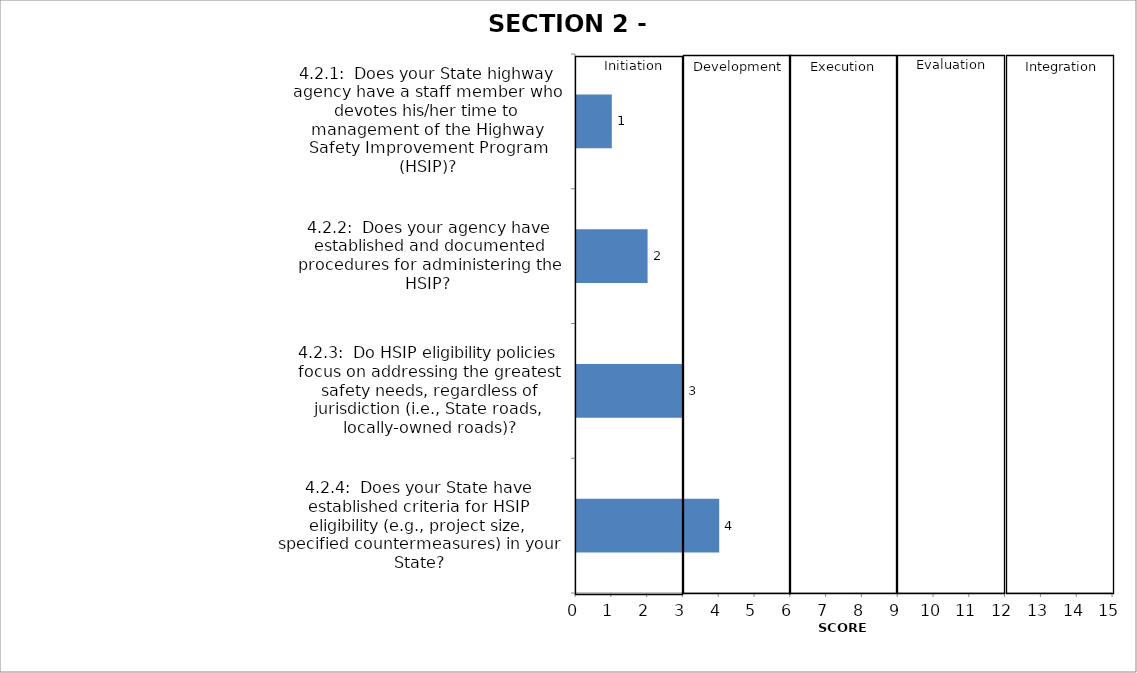
| Category | 1 2 3 4 |
|---|---|
| 4.2.1:  Does your State highway agency have a staff member who devotes his/her time to management of the Highway Safety Improvement Program (HSIP)? | 1 |
| 4.2.2:  Does your agency have established and documented procedures for administering the HSIP?  | 2 |
| 4.2.3:  Do HSIP eligibility policies focus on addressing the greatest safety needs, regardless of jurisdiction (i.e., State roads, locally-owned roads)? | 3 |
| 4.2.4:  Does your State have established criteria for HSIP eligibility (e.g., project size, specified countermeasures) in your State? | 4 |